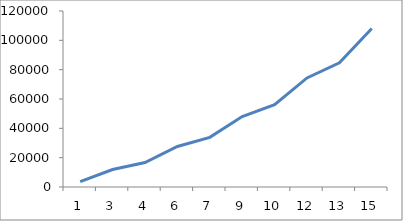
| Category | Series 0 |
|---|---|
| 1.0 | 3600 |
| 3.0 | 11908.44 |
| 4.0 | 16675.848 |
| 6.0 | 27601.025 |
| 7.0 | 33831.685 |
| 9.0 | 48031.743 |
| 10.0 | 56091.148 |
| 12.0 | 74378.763 |
| 13.0 | 84718.016 |
| 15.0 | 108095.771 |